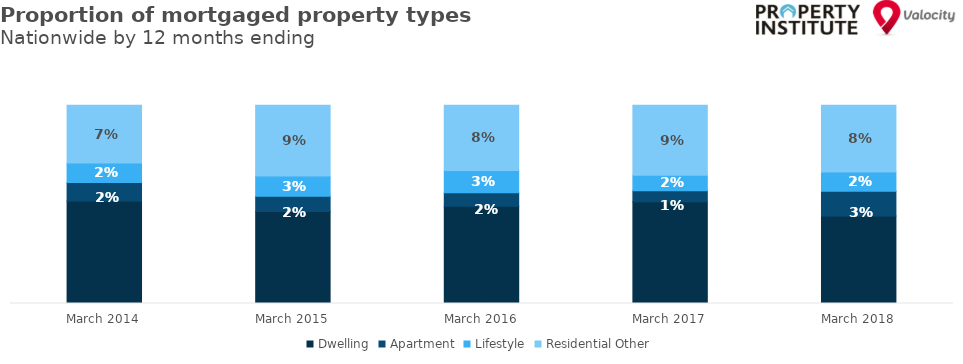
| Category | Dwelling | Apartment | Lifestyle | Residential Other |
|---|---|---|---|---|
| 2014-03-01 | 0.879 | 0.023 | 0.024 | 0.073 |
| 2015-03-01 | 0.866 | 0.019 | 0.026 | 0.089 |
| 2016-03-01 | 0.872 | 0.017 | 0.028 | 0.082 |
| 2017-03-01 | 0.878 | 0.014 | 0.019 | 0.088 |
| 2018-03-01 | 0.86 | 0.031 | 0.024 | 0.084 |